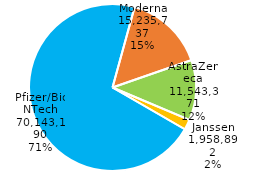
| Category | Series 0 |
|---|---|
| Pfizer/BioNTech | 70143190 |
| Moderna | 15235737 |
| AstraZeneca | 11543371 |
| Janssen | 1958892 |